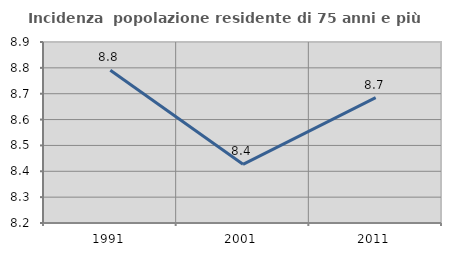
| Category | Incidenza  popolazione residente di 75 anni e più |
|---|---|
| 1991.0 | 8.791 |
| 2001.0 | 8.427 |
| 2011.0 | 8.685 |